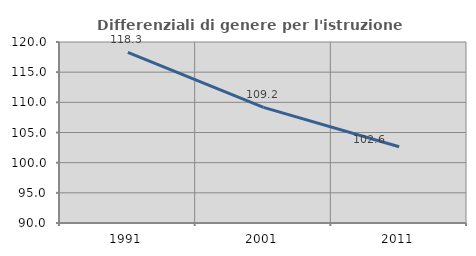
| Category | Differenziali di genere per l'istruzione superiore |
|---|---|
| 1991.0 | 118.277 |
| 2001.0 | 109.168 |
| 2011.0 | 102.646 |